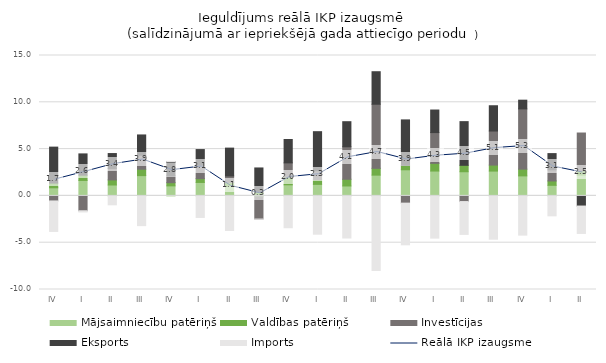
| Category | Mājsaimniecību patēriņš | Valdības patēriņš | Investīcijas | Eksports | Imports |
|---|---|---|---|---|---|
| IV | 0.866 | 0.499 | -0.54 | 3.847 | -3.256 |
| I | 1.651 | 0.558 | -1.587 | 2.278 | -0.13 |
| II | 1.164 | 0.542 | 1.227 | 1.591 | -0.952 |
| III | 2.166 | 0.682 | 1.497 | 2.167 | -3.175 |
| IV | 1.072 | 0.343 | 0.728 | 1.501 | 0.049 |
| I | 1.437 | 0.407 | 1.437 | 1.669 | -2.3 |
| II | 1.076 | 0.364 | 0.696 | 2.969 | -3.697 |
| III | -0.096 | 0.377 | -2.377 | 2.609 | -0.011 |
| IV | 1.185 | 0.816 | 1.527 | 2.499 | -3.402 |
| I | 1.231 | 0.509 | 0.953 | 4.168 | -4.093 |
| II | 1.061 | 0.717 | 3.472 | 2.677 | -4.499 |
| III | 2.218 | 0.728 | 6.846 | 3.475 | -7.969 |
| IV | 2.79 | 0.475 | -0.773 | 4.855 | -4.452 |
| I | 2.655 | 0.821 | 3.288 | 2.411 | -4.512 |
| II | 2.581 | 0.686 | -0.605 | 4.667 | -3.508 |
| III | 2.651 | 0.642 | 3.638 | 2.702 | -4.626 |
| IV | 2.138 | 0.721 | 6.436 | 0.932 | -4.189 |
| I | 1.13 | 0.467 | 1.187 | 1.735 | -2.128 |
| II | 2.22 | 0.46 | 4.039 | -1.084 | -2.928 |